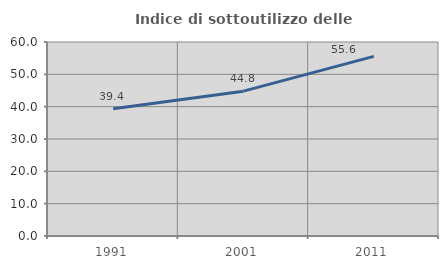
| Category | Indice di sottoutilizzo delle abitazioni  |
|---|---|
| 1991.0 | 39.37 |
| 2001.0 | 44.8 |
| 2011.0 | 55.556 |